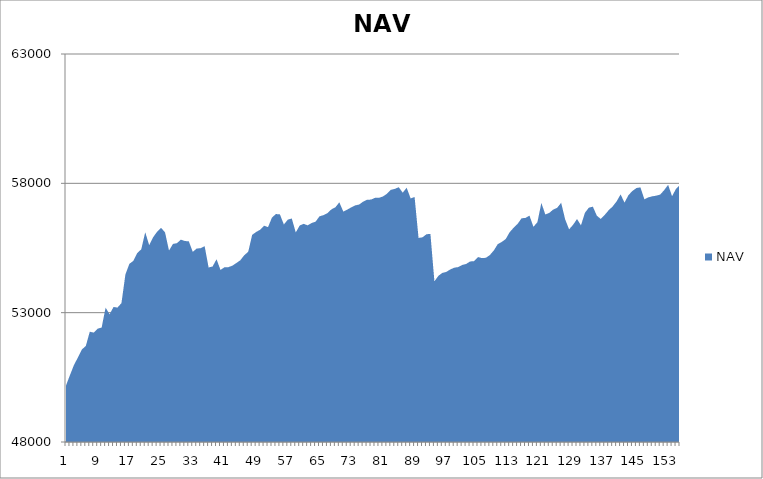
| Category | NAV |
|---|---|
| 0 | 50185.185 |
| 1 | 50585.185 |
| 2 | 50973.977 |
| 3 | 51265.977 |
| 4 | 51576.741 |
| 5 | 51711.523 |
| 6 | 52262.893 |
| 7 | 52230.24 |
| 8 | 52381.556 |
| 9 | 52425.915 |
| 10 | 53192.581 |
| 11 | 52939.146 |
| 12 | 53220.069 |
| 13 | 53197.341 |
| 14 | 53369.61 |
| 15 | 54480.721 |
| 16 | 54888.365 |
| 17 | 55001.902 |
| 18 | 55308.308 |
| 19 | 55448.308 |
| 20 | 56110.305 |
| 21 | 55610.305 |
| 22 | 55916.954 |
| 23 | 56129.798 |
| 24 | 56279.798 |
| 25 | 56105.301 |
| 26 | 55401.645 |
| 27 | 55657.201 |
| 28 | 55686.925 |
| 29 | 55823.001 |
| 30 | 55769.596 |
| 31 | 55759.375 |
| 32 | 55350.284 |
| 33 | 55480.284 |
| 34 | 55492.498 |
| 35 | 55570.42 |
| 36 | 54746.89 |
| 37 | 54783.7 |
| 38 | 55066.459 |
| 39 | 54651.074 |
| 40 | 54754.078 |
| 41 | 54760.213 |
| 42 | 54816.924 |
| 43 | 54917.296 |
| 44 | 55025.73 |
| 45 | 55220.535 |
| 46 | 55353.465 |
| 47 | 56009.309 |
| 48 | 56118.959 |
| 49 | 56205.212 |
| 50 | 56362.876 |
| 51 | 56307.394 |
| 52 | 56678.935 |
| 53 | 56813.264 |
| 54 | 56799.502 |
| 55 | 56409.112 |
| 56 | 56596.44 |
| 57 | 56640.493 |
| 58 | 56102.227 |
| 59 | 56370.449 |
| 60 | 56434.248 |
| 61 | 56376.841 |
| 62 | 56464.524 |
| 63 | 56518.022 |
| 64 | 56724.747 |
| 65 | 56770.361 |
| 66 | 56848.099 |
| 67 | 56992.896 |
| 68 | 57073.571 |
| 69 | 57266.481 |
| 70 | 56908.016 |
| 71 | 56984.939 |
| 72 | 57069.276 |
| 73 | 57147.627 |
| 74 | 57179.83 |
| 75 | 57291.17 |
| 76 | 57366.35 |
| 77 | 57371.599 |
| 78 | 57439.215 |
| 79 | 57440.895 |
| 80 | 57490.895 |
| 81 | 57593.679 |
| 82 | 57746.643 |
| 83 | 57785.413 |
| 84 | 57849.748 |
| 85 | 57639.346 |
| 86 | 57828.82 |
| 87 | 57417.055 |
| 88 | 57471.335 |
| 89 | 55888.376 |
| 90 | 55913.907 |
| 91 | 56031.989 |
| 92 | 56044.711 |
| 93 | 54210.631 |
| 94 | 54422.612 |
| 95 | 54536.647 |
| 96 | 54575.903 |
| 97 | 54670.229 |
| 98 | 54737.367 |
| 99 | 54762.386 |
| 100 | 54842.923 |
| 101 | 54881.385 |
| 102 | 54978.816 |
| 103 | 54991.283 |
| 104 | 55149.699 |
| 105 | 55109.498 |
| 106 | 55121.656 |
| 107 | 55227.569 |
| 108 | 55405.15 |
| 109 | 55650.183 |
| 110 | 55733.424 |
| 111 | 55846.244 |
| 112 | 56110.95 |
| 113 | 56283.172 |
| 114 | 56430.541 |
| 115 | 56648.489 |
| 116 | 56663.919 |
| 117 | 56752.272 |
| 118 | 56318.108 |
| 119 | 56496.442 |
| 120 | 57240.145 |
| 121 | 56797.081 |
| 122 | 56857.303 |
| 123 | 56985.874 |
| 124 | 57053.805 |
| 125 | 57249.117 |
| 126 | 56612.311 |
| 127 | 56221.507 |
| 128 | 56394.346 |
| 129 | 56622.008 |
| 130 | 56375.255 |
| 131 | 56862.384 |
| 132 | 57060.137 |
| 133 | 57099.524 |
| 134 | 56750.37 |
| 135 | 56622.71 |
| 136 | 56780.605 |
| 137 | 56961.84 |
| 138 | 57105.4 |
| 139 | 57301.96 |
| 140 | 57570.545 |
| 141 | 57256.886 |
| 142 | 57545.679 |
| 143 | 57705.679 |
| 144 | 57817.679 |
| 145 | 57845.512 |
| 146 | 57383.973 |
| 147 | 57457.609 |
| 148 | 57498.333 |
| 149 | 57523.57 |
| 150 | 57565.004 |
| 151 | 57735.592 |
| 152 | 57941.474 |
| 153 | 57502.813 |
| 154 | 57789.769 |
| 155 | 57937.821 |